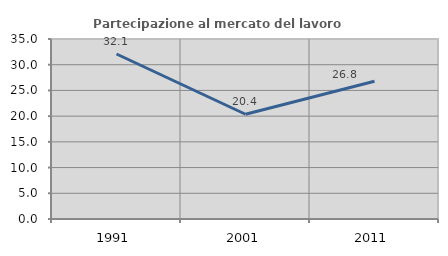
| Category | Partecipazione al mercato del lavoro  femminile |
|---|---|
| 1991.0 | 32.086 |
| 2001.0 | 20.37 |
| 2011.0 | 26.786 |